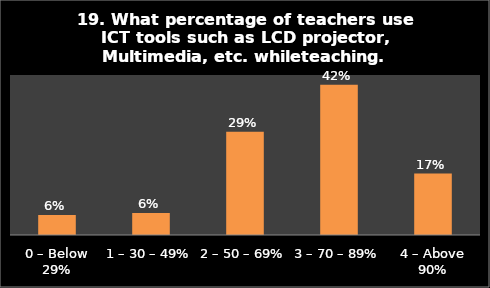
| Category | Series 0 |
|---|---|
| 0 – Below 29% | 0.056 |
| 1 – 30 – 49% | 0.062 |
| 2 – 50 – 69% | 0.291 |
| 3 – 70 – 89% | 0.422 |
| 4 – Above 90% | 0.173 |